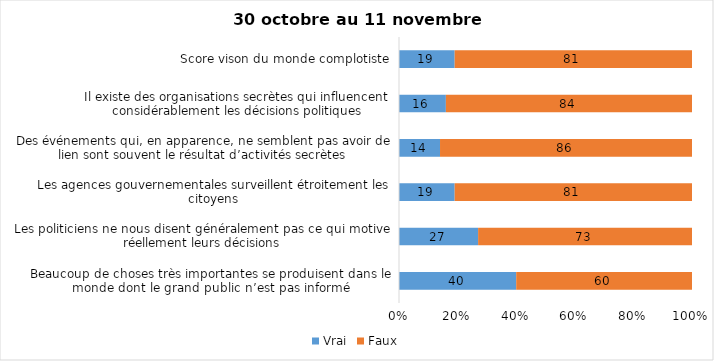
| Category | Vrai | Faux |
|---|---|---|
| Beaucoup de choses très importantes se produisent dans le monde dont le grand public n’est pas informé | 40 | 60 |
| Les politiciens ne nous disent généralement pas ce qui motive réellement leurs décisions | 27 | 73 |
| Les agences gouvernementales surveillent étroitement les citoyens | 19 | 81 |
| Des événements qui, en apparence, ne semblent pas avoir de lien sont souvent le résultat d’activités secrètes | 14 | 86 |
| Il existe des organisations secrètes qui influencent considérablement les décisions politiques | 16 | 84 |
| Score vison du monde complotiste | 19 | 81 |